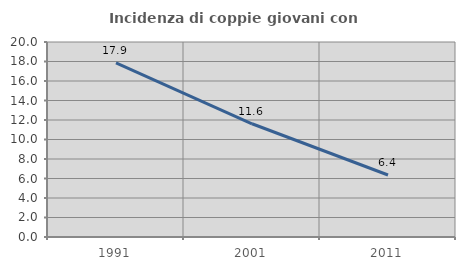
| Category | Incidenza di coppie giovani con figli |
|---|---|
| 1991.0 | 17.851 |
| 2001.0 | 11.612 |
| 2011.0 | 6.357 |